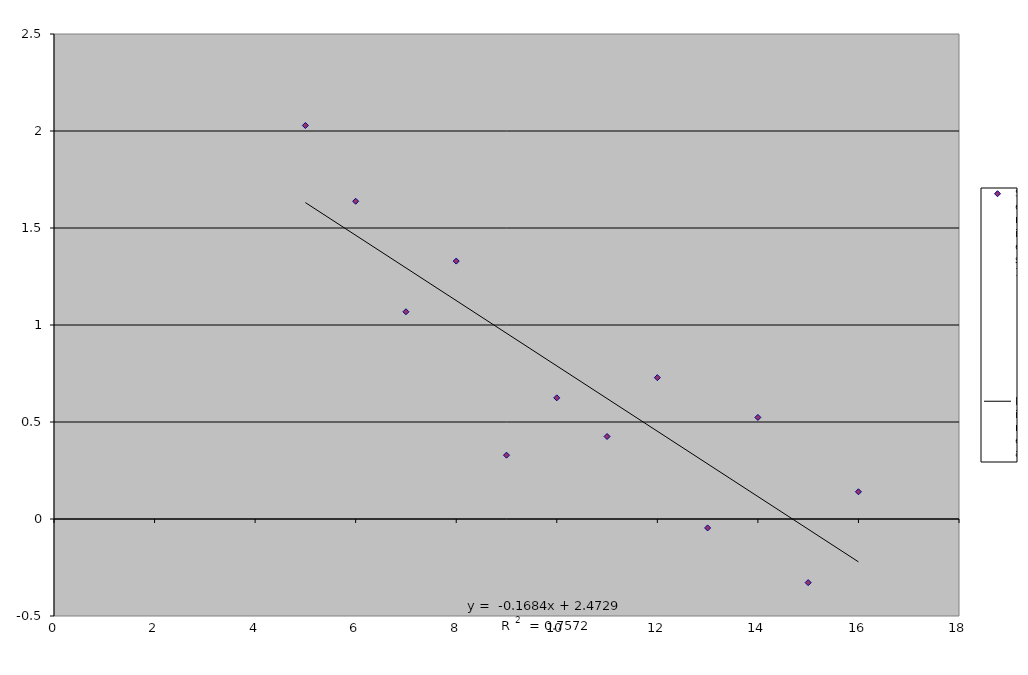
| Category | Series 0 |
|---|---|
| 5.0 | 2.028 |
| 6.0 | 1.638 |
| 7.0 | 1.068 |
| 8.0 | 1.329 |
| 9.0 | 0.329 |
| 10.0 | 0.625 |
| 11.0 | 0.425 |
| 12.0 | 0.729 |
| 13.0 | -0.046 |
| 14.0 | 0.524 |
| 15.0 | -0.328 |
| 16.0 | 0.14 |